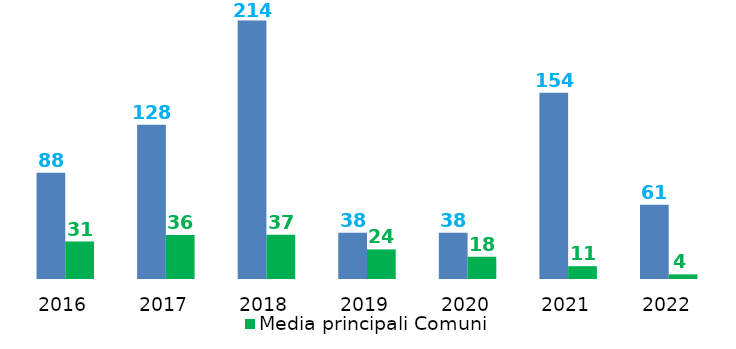
| Category | Indicatore annuale di tempestività dei pagamenti | Media principali Comuni |
|---|---|---|
| 2016.0 | 88 | 30.939 |
| 2017.0 | 127.55 | 36.337 |
| 2018.0 | 213.8 | 36.522 |
| 2019.0 | 38.22 | 24.474 |
| 2020.0 | 38.22 | 18.42 |
| 2021.0 | 154.11 | 10.619 |
| 2022.0 | 61.43 | 3.85 |